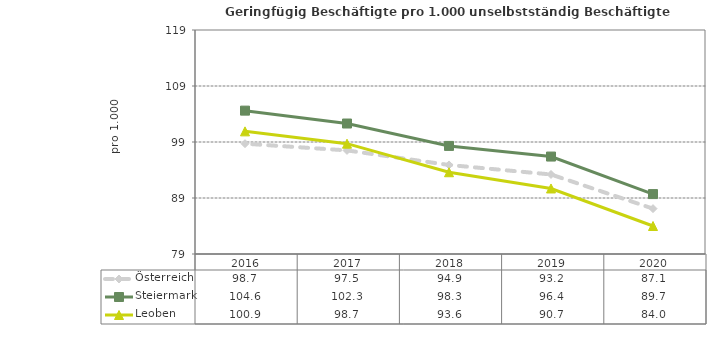
| Category | Österreich | Steiermark | Leoben |
|---|---|---|---|
| 2020.0 | 87.1 | 89.7 | 84 |
| 2019.0 | 93.2 | 96.4 | 90.7 |
| 2018.0 | 94.9 | 98.3 | 93.6 |
| 2017.0 | 97.5 | 102.3 | 98.7 |
| 2016.0 | 98.7 | 104.6 | 100.9 |